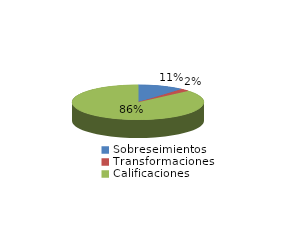
| Category | Series 0 |
|---|---|
| Sobreseimientos | 156 |
| Transformaciones | 32 |
| Calificaciones | 1192 |